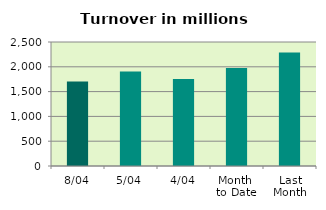
| Category | Series 0 |
|---|---|
| 8/04 | 1704.757 |
| 5/04 | 1904.729 |
| 4/04 | 1752.082 |
| Month 
to Date | 1974.06 |
| Last
Month | 2286.259 |